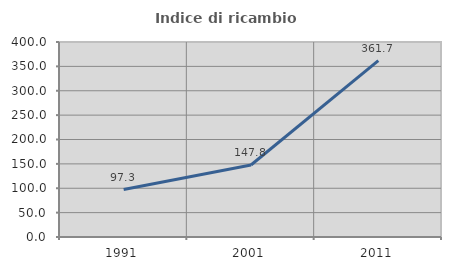
| Category | Indice di ricambio occupazionale  |
|---|---|
| 1991.0 | 97.285 |
| 2001.0 | 147.756 |
| 2011.0 | 361.658 |